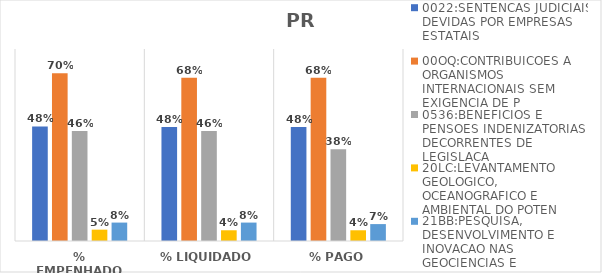
| Category | 0022:SENTENCAS JUDICIAIS DEVIDAS POR EMPRESAS ESTATAIS | 00OQ:CONTRIBUICOES A ORGANISMOS INTERNACIONAIS SEM EXIGENCIA DE P | 0536:BENEFICIOS E PENSOES INDENIZATORIAS DECORRENTES DE LEGISLACA | 20LC:LEVANTAMENTO GEOLOGICO, OCEANOGRAFICO E AMBIENTAL DO POTEN | 21BB:PESQUISA, DESENVOLVIMENTO E INOVACAO NAS GEOCIENCIAS E |
|---|---|---|---|---|---|
| % EMPENHADO | 0.477 | 0.699 | 0.459 | 0.047 | 0.077 |
| % LIQUIDADO | 0.475 | 0.681 | 0.459 | 0.045 | 0.077 |
| % PAGO | 0.475 | 0.681 | 0.383 | 0.045 | 0.07 |